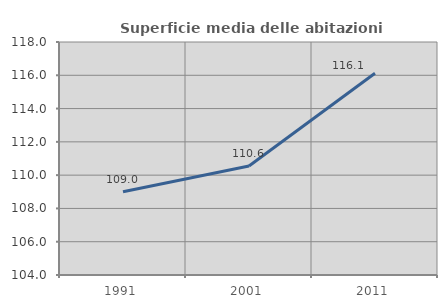
| Category | Superficie media delle abitazioni occupate |
|---|---|
| 1991.0 | 108.997 |
| 2001.0 | 110.553 |
| 2011.0 | 116.127 |